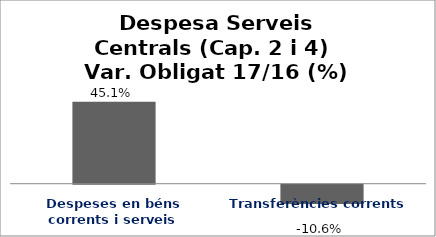
| Category | Series 0 |
|---|---|
| Despeses en béns corrents i serveis | 0.451 |
| Transferències corrents | -0.106 |